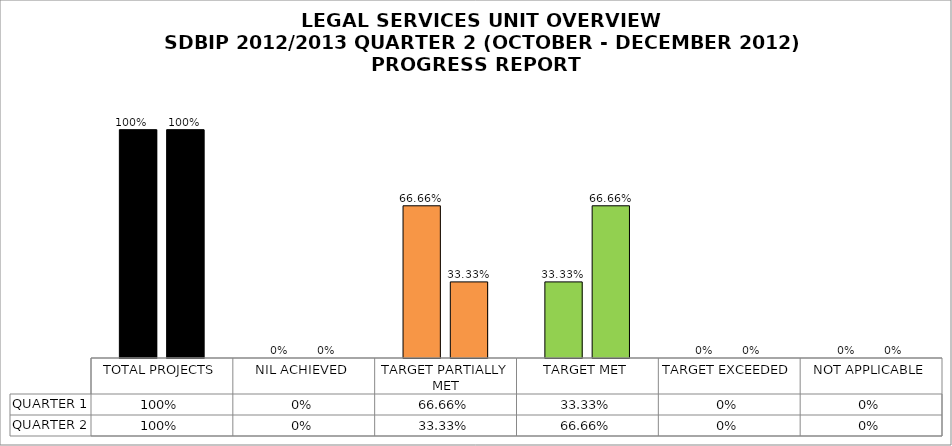
| Category | QUARTER 1 | QUARTER 2 |
|---|---|---|
| TOTAL PROJECTS | 1 | 1 |
| NIL ACHIEVED | 0 | 0 |
| TARGET PARTIALLY MET | 0.667 | 0.333 |
| TARGET MET | 0.333 | 0.667 |
| TARGET EXCEEDED | 0 | 0 |
| NOT APPLICABLE | 0 | 0 |